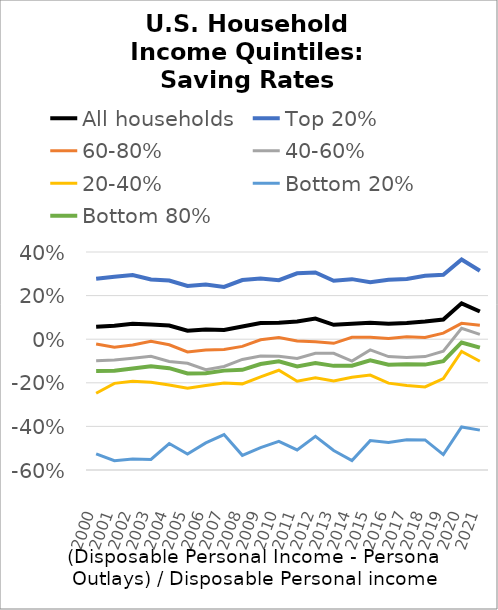
| Category | All households | Top 20% | 60-80% | 40-60% | 20-40% | Bottom 20% | Bottom 80% |
|---|---|---|---|---|---|---|---|
| 2000.0 | 0.057 | 0.277 | -0.022 | -0.099 | -0.248 | -0.526 | -0.146 |
| 2001.0 | 0.062 | 0.286 | -0.037 | -0.095 | -0.202 | -0.557 | -0.145 |
| 2002.0 | 0.071 | 0.294 | -0.027 | -0.087 | -0.193 | -0.55 | -0.135 |
| 2003.0 | 0.067 | 0.274 | -0.009 | -0.078 | -0.198 | -0.552 | -0.124 |
| 2004.0 | 0.063 | 0.269 | -0.025 | -0.102 | -0.21 | -0.478 | -0.133 |
| 2005.0 | 0.039 | 0.244 | -0.059 | -0.111 | -0.224 | -0.527 | -0.157 |
| 2006.0 | 0.044 | 0.251 | -0.049 | -0.14 | -0.212 | -0.476 | -0.156 |
| 2007.0 | 0.043 | 0.24 | -0.047 | -0.125 | -0.201 | -0.437 | -0.144 |
| 2008.0 | 0.058 | 0.271 | -0.033 | -0.093 | -0.205 | -0.533 | -0.141 |
| 2009.0 | 0.074 | 0.279 | -0.003 | -0.078 | -0.173 | -0.497 | -0.114 |
| 2010.0 | 0.076 | 0.271 | 0.008 | -0.078 | -0.143 | -0.469 | -0.101 |
| 2011.0 | 0.082 | 0.302 | -0.008 | -0.089 | -0.193 | -0.508 | -0.125 |
| 2012.0 | 0.095 | 0.306 | -0.012 | -0.065 | -0.177 | -0.446 | -0.109 |
| 2013.0 | 0.066 | 0.268 | -0.019 | -0.065 | -0.192 | -0.511 | -0.122 |
| 2014.0 | 0.071 | 0.275 | 0.008 | -0.1 | -0.175 | -0.557 | -0.122 |
| 2015.0 | 0.076 | 0.262 | 0.009 | -0.049 | -0.165 | -0.465 | -0.097 |
| 2016.0 | 0.071 | 0.272 | 0.003 | -0.08 | -0.202 | -0.473 | -0.117 |
| 2017.0 | 0.075 | 0.276 | 0.011 | -0.084 | -0.213 | -0.461 | -0.115 |
| 2018.0 | 0.081 | 0.291 | 0.008 | -0.08 | -0.219 | -0.462 | -0.117 |
| 2019.0 | 0.09 | 0.296 | 0.028 | -0.055 | -0.181 | -0.529 | -0.101 |
| 2020.0 | 0.164 | 0.365 | 0.073 | 0.05 | -0.056 | -0.403 | -0.015 |
| 2021.0 | 0.127 | 0.314 | 0.064 | 0.022 | -0.101 | -0.417 | -0.038 |